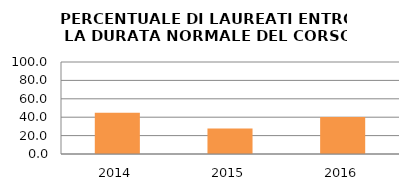
| Category | 2014 2015 2016 |
|---|---|
| 2014.0 | 44.737 |
| 2015.0 | 27.778 |
| 2016.0 | 40.179 |